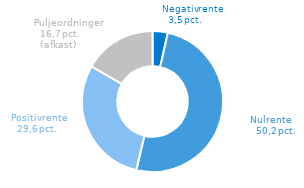
| Category | Andel af indlån i alt |
|---|---|
| Negativ rente | 3.5 |
| Nul rente | 50.2 |
| Positiv rente | 29.6 |
| Puljeordninger (afkast) | 16.7 |